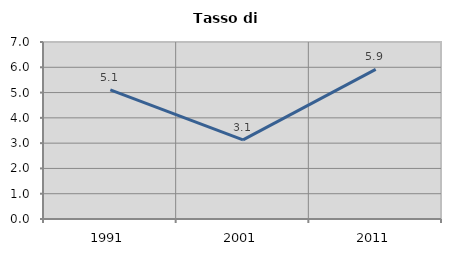
| Category | Tasso di disoccupazione   |
|---|---|
| 1991.0 | 5.107 |
| 2001.0 | 3.128 |
| 2011.0 | 5.917 |